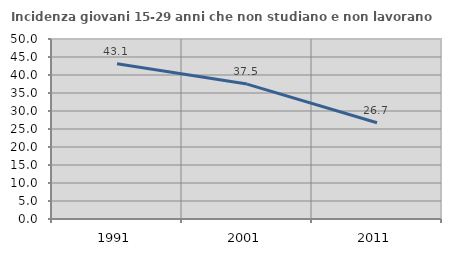
| Category | Incidenza giovani 15-29 anni che non studiano e non lavorano  |
|---|---|
| 1991.0 | 43.103 |
| 2001.0 | 37.477 |
| 2011.0 | 26.734 |